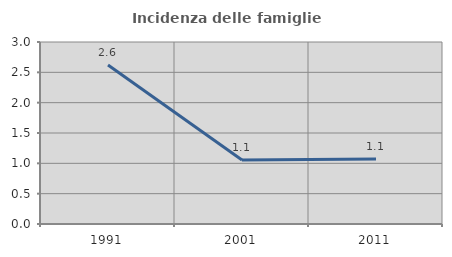
| Category | Incidenza delle famiglie numerose |
|---|---|
| 1991.0 | 2.622 |
| 2001.0 | 1.055 |
| 2011.0 | 1.07 |